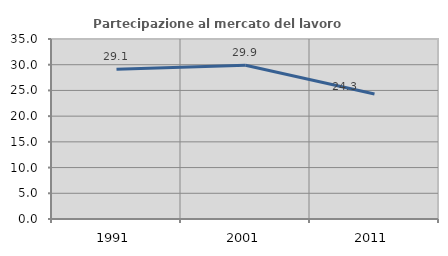
| Category | Partecipazione al mercato del lavoro  femminile |
|---|---|
| 1991.0 | 29.095 |
| 2001.0 | 29.909 |
| 2011.0 | 24.309 |